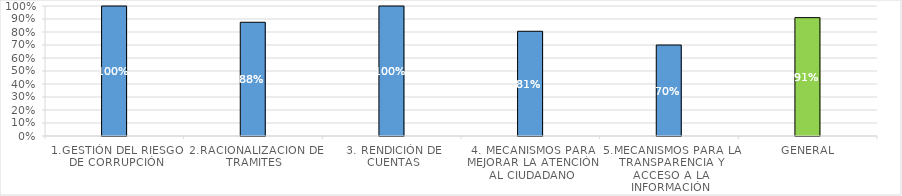
| Category | Series 0 |
|---|---|
| 1.GESTIÓN DEL RIESGO DE CORRUPCIÓN | 1 |
| 2.RACIONALIZACION DE TRAMITES | 0.875 |
| 3. RENDICIÓN DE CUENTAS | 1 |
| 4. MECANISMOS PARA MEJORAR LA ATENCIÓN AL CIUDADANO | 0.806 |
| 5.MECANISMOS PARA LA TRANSPARENCIA Y ACCESO A LA INFORMACIÓN | 0.7 |
| GENERAL | 0.911 |